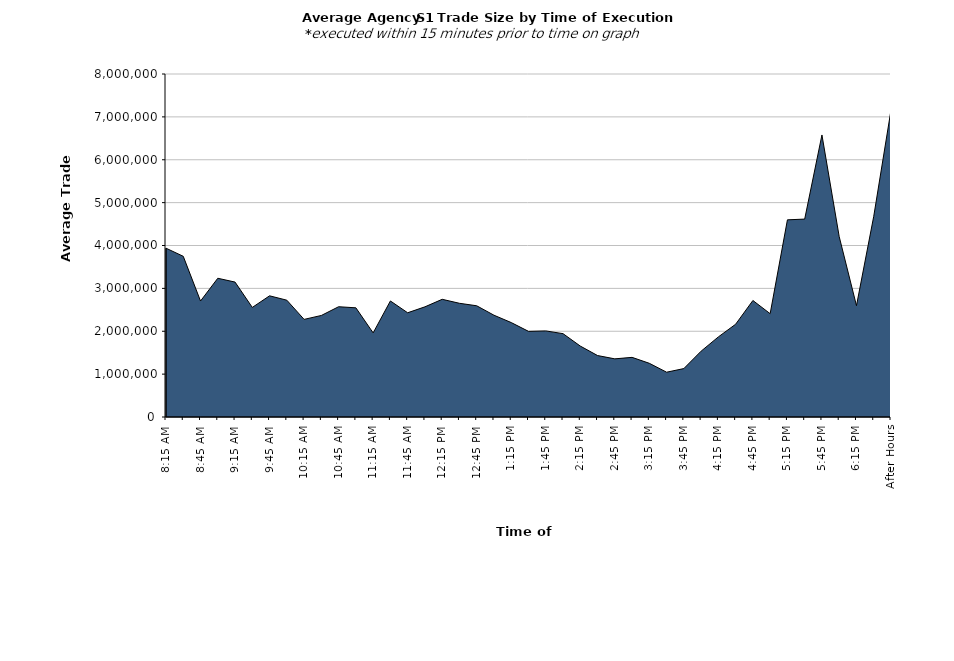
| Category | Series 0 |
|---|---|
| 8:15 AM | 3937402.43 |
| 8:30 AM | 3748008.564 |
| 8:45 AM | 2704894.486 |
| 9:00 AM | 3235972.792 |
| 9:15 AM | 3146698.257 |
| 9:30 AM | 2555483.467 |
| 9:45 AM | 2826196.434 |
| 10:00 AM | 2724270.941 |
| 10:15 AM | 2276890.623 |
| 10:30 AM | 2368122.57 |
| 10:45 AM | 2571976.833 |
| 11:00 AM | 2546489.475 |
| 11:15 AM | 1961432.322 |
| 11:30 AM | 2706616.896 |
| 11:45 AM | 2431404.694 |
| 12:00 PM | 2569243.596 |
| 12:15 PM | 2745030.583 |
| 12:30 PM | 2652186.894 |
| 12:45 PM | 2594367.257 |
| 1:00 PM | 2374268.425 |
| 1:15 PM | 2202343.969 |
| 1:30 PM | 1997620.119 |
| 1:45 PM | 2007799.409 |
| 2:00 PM | 1944080.603 |
| 2:15 PM | 1654732.664 |
| 2:30 PM | 1433591.439 |
| 2:45 PM | 1356054.76 |
| 3:00 PM | 1390681.581 |
| 3:15 PM | 1252283.332 |
| 3:30 PM | 1045048.703 |
| 3:45 PM | 1129728.905 |
| 4:00 PM | 1535595.968 |
| 4:15 PM | 1868804.947 |
| 4:30 PM | 2163658.271 |
| 4:45 PM | 2717551.892 |
| 5:00 PM | 2409418.13 |
| 5:15 PM | 4598562.188 |
| 5:30 PM | 4616073.418 |
| 5:45 PM | 6578107.022 |
| 6:00 PM | 4205258.987 |
| 6:15 PM | 2596421.333 |
| 6:30 PM | 4680455 |
| After Hours | 7159436.485 |